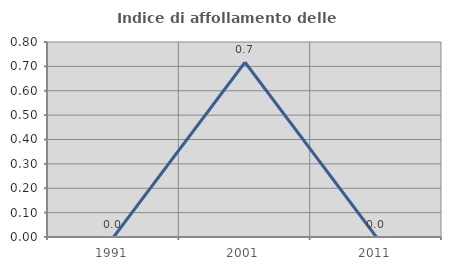
| Category | Indice di affollamento delle abitazioni  |
|---|---|
| 1991.0 | 0 |
| 2001.0 | 0.717 |
| 2011.0 | 0 |